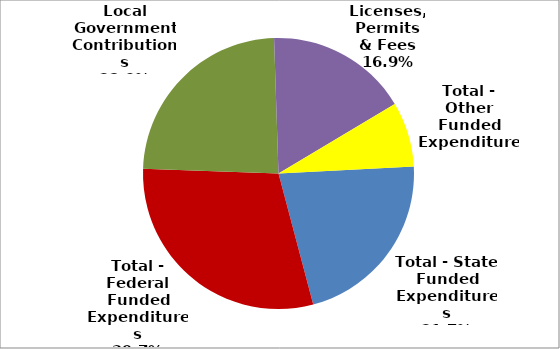
| Category | Series 0 |
|---|---|
| Total - State Funded Expenditures | 126123 |
| Total - Federal Funded Expenditures | 172465 |
| Local Government Contributions | 139011 |
| Licenses, Permits & Fees | 98449 |
| Total - Other Funded Expenditures | 45003 |